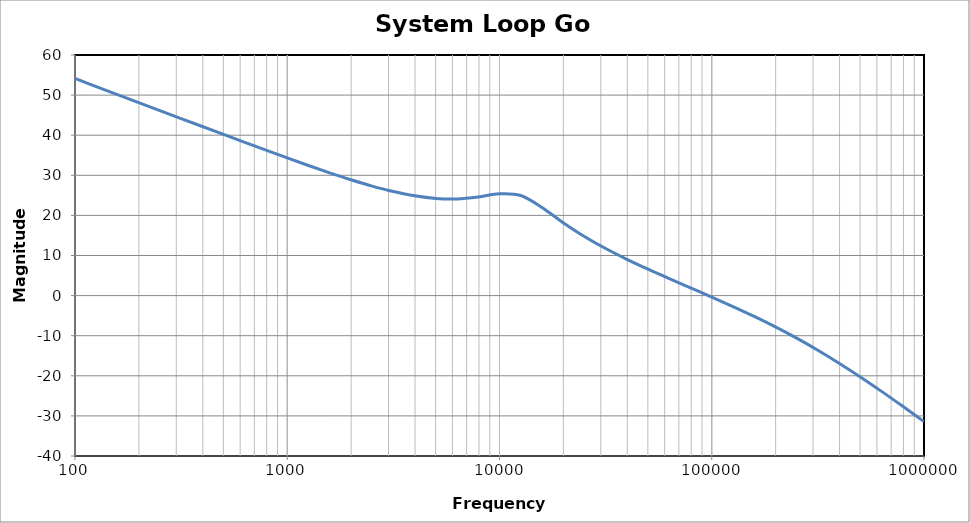
| Category | System Loop Gain |
|---|---|
| 100.0 | 54.135 |
| 125.89254117941677 | 52.136 |
| 158.48931924611153 | 50.138 |
| 199.52623149688802 | 48.141 |
| 251.18864315095806 | 46.145 |
| 316.22776601683825 | 44.153 |
| 398.1071705534976 | 42.164 |
| 501.1872336272727 | 40.182 |
| 630.9573444801932 | 38.211 |
| 794.3282347242821 | 36.257 |
| 1000.0 | 34.329 |
| 1258.925411794168 | 32.441 |
| 1584.8931924611156 | 30.618 |
| 1995.2623149688804 | 28.891 |
| 2511.886431509581 | 27.309 |
| 3162.2776601683804 | 25.941 |
| 3981.071705534977 | 24.875 |
| 5011.872336272732 | 24.221 |
| 6309.573444801938 | 24.102 |
| 7943.282347242815 | 24.594 |
| 10000.0 | 25.403 |
| 12589.254117941671 | 24.961 |
| 15848.931924611146 | 21.978 |
| 19952.623149688792 | 18.192 |
| 25118.86431509586 | 14.745 |
| 31622.77660168384 | 11.739 |
| 39810.71705534974 | 9.057 |
| 50118.723362727294 | 6.586 |
| 63095.73444801934 | 4.236 |
| 79432.82347242824 | 1.937 |
| 100000.0 | -0.365 |
| 125892.54117941685 | -2.722 |
| 158489.31924611164 | -5.183 |
| 199526.23149688813 | -7.794 |
| 251188.64315095844 | -10.596 |
| 316227.7660168382 | -13.613 |
| 398107.17055349716 | -16.848 |
| 501187.23362727347 | -20.282 |
| 630957.3444801942 | -23.882 |
| 794328.2347242833 | -27.608 |
| 1000000.0 | -31.426 |